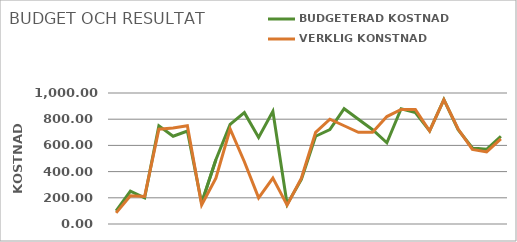
| Category | BUDGETERAD KOSTNAD | VERKLIG KONSTNAD |
|---|---|---|
| 0 | 100 | 85 |
| 1 | 250 | 215 |
| 2 | 200 | 210 |
| 3 | 750 | 724 |
| 4 | 670 | 733 |
| 5 | 710 | 750 |
| 6 | 160 | 145 |
| 7 | 490 | 350 |
| 8 | 760 | 725 |
| 9 | 850 | 475 |
| 10 | 660 | 200 |
| 11 | 860 | 350 |
| 12 | 150 | 144 |
| 13 | 340 | 350 |
| 14 | 670 | 700 |
| 15 | 720 | 800 |
| 16 | 880 | 750 |
| 17 | 800 | 700 |
| 18 | 720 | 700 |
| 19 | 620 | 820 |
| 20 | 880 | 875 |
| 21 | 850 | 875 |
| 22 | 710 | 710 |
| 23 | 950 | 949 |
| 24 | 720 | 725 |
| 25 | 580 | 569 |
| 26 | 570 | 550 |
| 27 | 670 | 650 |